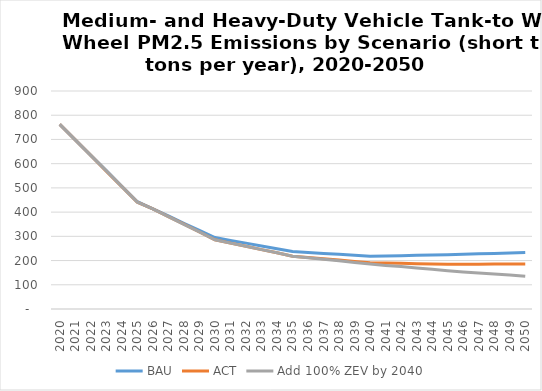
| Category | BAU | ACT | Add 100% ZEV by 2040 |
|---|---|---|---|
| 2020.0 | 762 | 762 | 762.35 |
| 2021.0 | 698 | 698 | 698 |
| 2022.0 | 634 | 634 | 634 |
| 2023.0 | 571 | 569 | 570 |
| 2024.0 | 507 | 505 | 505 |
| 2025.0 | 443 | 441 | 441.242 |
| 2026.0 | 413 | 413 | 413 |
| 2027.0 | 384 | 381 | 381 |
| 2028.0 | 354 | 350 | 349 |
| 2029.0 | 325 | 318 | 318 |
| 2030.0 | 295 | 286 | 285.685 |
| 2031.0 | 283 | 272 | 272 |
| 2032.0 | 272 | 259 | 259 |
| 2033.0 | 260 | 245 | 245 |
| 2034.0 | 249 | 232 | 232 |
| 2035.0 | 237 | 218 | 218.029 |
| 2036.0 | 233 | 213 | 212 |
| 2037.0 | 229 | 207 | 205 |
| 2038.0 | 226 | 202 | 199 |
| 2039.0 | 222 | 196 | 192 |
| 2040.0 | 218 | 191 | 186.013 |
| 2041.0 | 219 | 190 | 180 |
| 2042.0 | 220 | 189 | 175 |
| 2043.0 | 222 | 187 | 169 |
| 2044.0 | 223 | 186 | 164 |
| 2045.0 | 224 | 185 | 157.988 |
| 2046.0 | 226 | 185 | 153 |
| 2047.0 | 228 | 185 | 149 |
| 2048.0 | 229 | 186 | 144 |
| 2049.0 | 231 | 186 | 140 |
| 2050.0 | 233 | 186 | 134.92 |